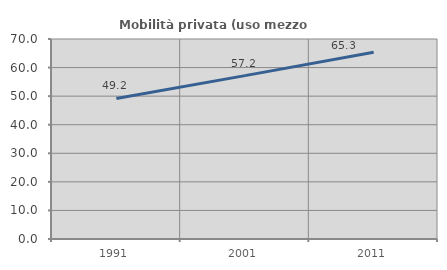
| Category | Mobilità privata (uso mezzo privato) |
|---|---|
| 1991.0 | 49.196 |
| 2001.0 | 57.186 |
| 2011.0 | 65.348 |